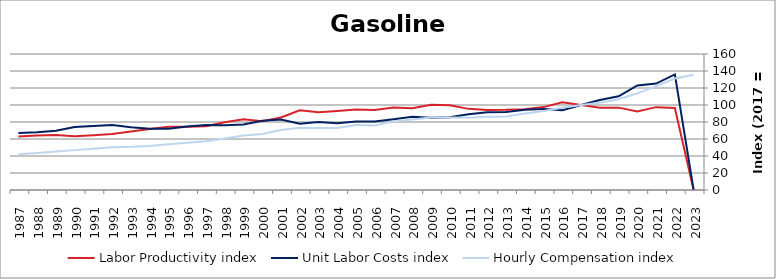
| Category | Labor Productivity index | Unit Labor Costs index | Hourly Compensation index |
|---|---|---|---|
| 2023.0 | 0 | 0 | 135.691 |
| 2022.0 | 96.418 | 136.005 | 131.133 |
| 2021.0 | 97.484 | 125.177 | 122.027 |
| 2020.0 | 92.425 | 123.034 | 113.715 |
| 2019.0 | 96.897 | 110.19 | 106.77 |
| 2018.0 | 96.81 | 105.918 | 102.539 |
| 2017.0 | 100 | 100 | 100 |
| 2016.0 | 103.144 | 93.789 | 96.737 |
| 2015.0 | 97.514 | 95.25 | 92.882 |
| 2014.0 | 95.124 | 94.496 | 89.888 |
| 2013.0 | 94.311 | 91.638 | 86.425 |
| 2012.0 | 94.17 | 91.406 | 86.077 |
| 2011.0 | 95.445 | 89.15 | 85.089 |
| 2010.0 | 99.693 | 85.573 | 85.311 |
| 2009.0 | 100.229 | 84.986 | 85.181 |
| 2008.0 | 96.167 | 86.208 | 82.904 |
| 2007.0 | 97.075 | 83.165 | 80.732 |
| 2006.0 | 94.041 | 80.598 | 75.796 |
| 2005.0 | 94.78 | 80.586 | 76.379 |
| 2004.0 | 93.049 | 78.465 | 73.011 |
| 2003.0 | 91.371 | 79.931 | 73.034 |
| 2002.0 | 93.746 | 78.036 | 73.156 |
| 2001.0 | 85.26 | 82.793 | 70.589 |
| 2000.0 | 80.869 | 81.452 | 65.869 |
| 1999.0 | 83.153 | 77.072 | 64.087 |
| 1998.0 | 79.591 | 76.198 | 60.647 |
| 1997.0 | 75.047 | 76.379 | 57.32 |
| 1996.0 | 74.306 | 74.714 | 55.517 |
| 1995.0 | 74.367 | 72.194 | 53.689 |
| 1994.0 | 71.668 | 72.094 | 51.668 |
| 1993.0 | 68.738 | 73.812 | 50.737 |
| 1992.0 | 65.906 | 76.418 | 50.364 |
| 1991.0 | 64.552 | 75.249 | 48.574 |
| 1990.0 | 63.301 | 74.106 | 46.91 |
| 1989.0 | 64.77 | 69.791 | 45.204 |
| 1988.0 | 64.09 | 67.973 | 43.564 |
| 1987.0 | 62.797 | 66.961 | 42.049 |